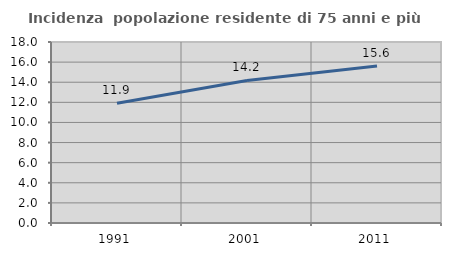
| Category | Incidenza  popolazione residente di 75 anni e più |
|---|---|
| 1991.0 | 11.9 |
| 2001.0 | 14.178 |
| 2011.0 | 15.604 |